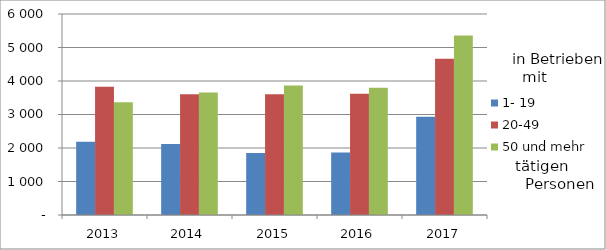
| Category | 1- 19 | 20-49 | 50 und mehr |
|---|---|---|---|
| 2013.0 | 2185 | 3829 | 3363 |
| 2014.0 | 2117 | 3601 | 3658 |
| 2015.0 | 1848 | 3603 | 3869 |
| 2016.0 | 1863 | 3623 | 3801 |
| 2017.0 | 2930 | 4661 | 5360 |